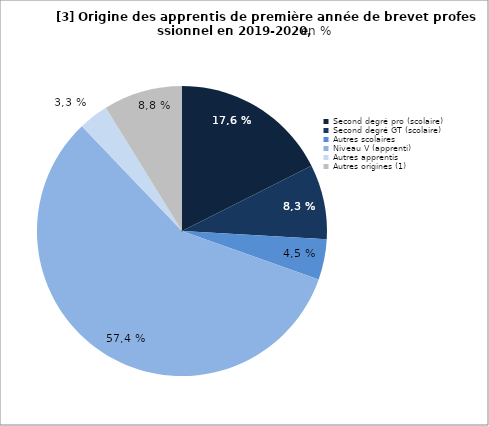
| Category | Series 0 |
|---|---|
| Second degré pro (scolaire) | 17.567 |
| Second degré GT (scolaire) | 8.342 |
| Autres scolaires | 4.511 |
| Niveau V (apprenti) | 57.446 |
| Autres apprentis | 3.327 |
| Autres origines (1) | 8.807 |